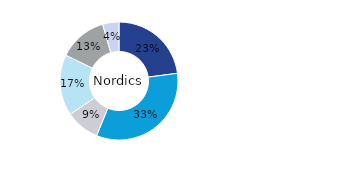
| Category | Nordics |
|---|---|
| Office | 0.229 |
| Residential | 0.333 |
| Retail | 0.092 |
| Logistics* | 0.167 |
| Public Sector | 0.133 |
| Other | 0.045 |